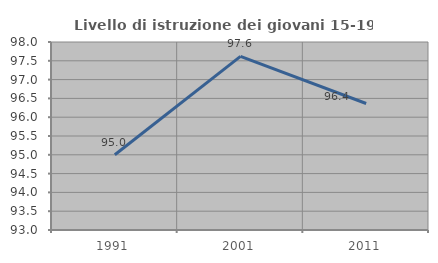
| Category | Livello di istruzione dei giovani 15-19 anni |
|---|---|
| 1991.0 | 95 |
| 2001.0 | 97.619 |
| 2011.0 | 96.364 |